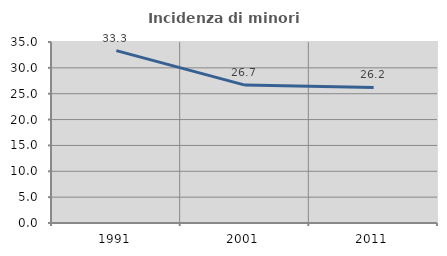
| Category | Incidenza di minori stranieri |
|---|---|
| 1991.0 | 33.333 |
| 2001.0 | 26.667 |
| 2011.0 | 26.214 |